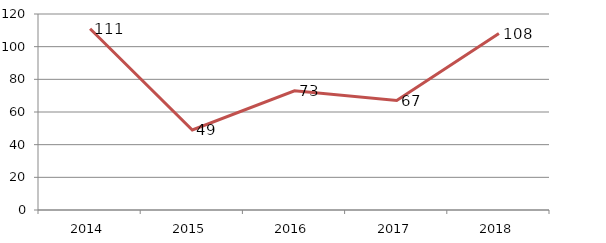
| Category | Total |
|---|---|
| 2014.0 | 111 |
| 2015.0 | 49 |
| 2016.0 | 73 |
| 2017.0 | 67 |
| 2018.0 | 108 |